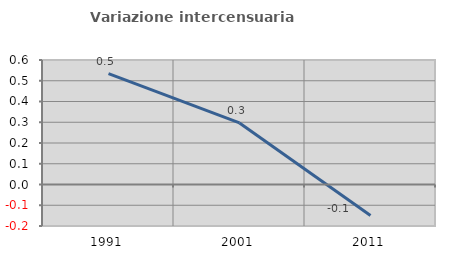
| Category | Variazione intercensuaria annua |
|---|---|
| 1991.0 | 0.534 |
| 2001.0 | 0.297 |
| 2011.0 | -0.15 |